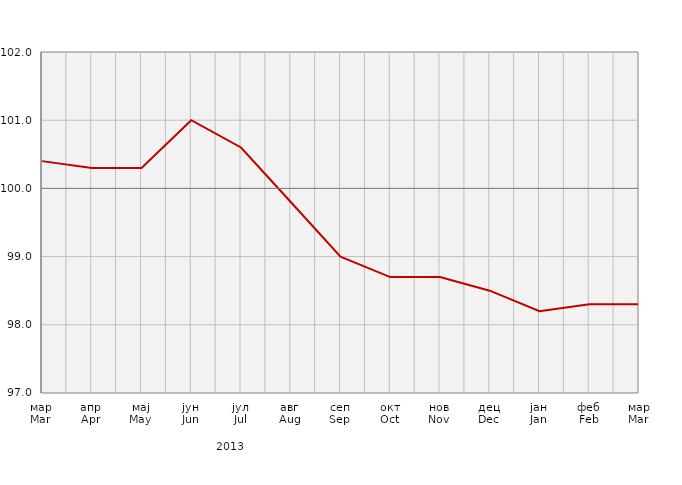
| Category | Индекси потрошачких цијена
Consumer price indices |
|---|---|
| мар
Mar | 100.4 |
| апр
Apr | 100.3 |
| мај
May | 100.3 |
| јун
Jun | 101 |
| јул
Jul | 100.6 |
| авг
Aug | 99.8 |
| сеп
Sep | 99 |
| окт
Oct | 98.7 |
| нов
Nov | 98.7 |
| дец
Dec | 98.5 |
| јан
Jan | 98.2 |
| феб
Feb | 98.3 |
| мар
Mar | 98.3 |